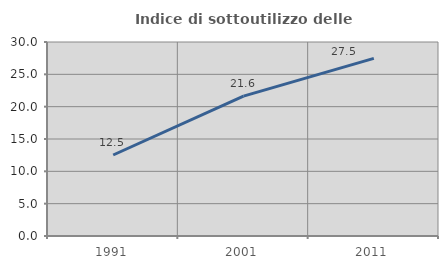
| Category | Indice di sottoutilizzo delle abitazioni  |
|---|---|
| 1991.0 | 12.525 |
| 2001.0 | 21.639 |
| 2011.0 | 27.466 |